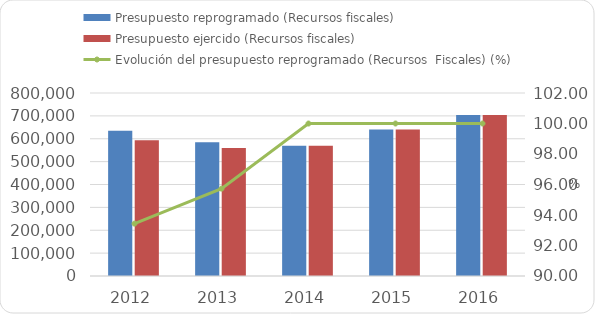
| Category | Presupuesto reprogramado (Recursos fiscales) | Presupuesto ejercido (Recursos fiscales)  |
|---|---|---|
| 2012 | 634664.6 | 592994.5 |
| 2013 | 584645.8 | 559675.9 |
| 2014 | 569365.9 | 569354.2 |
| 2015 | 640885.41 | 640885.402 |
| 2016 | 704293.4 | 704293.4 |